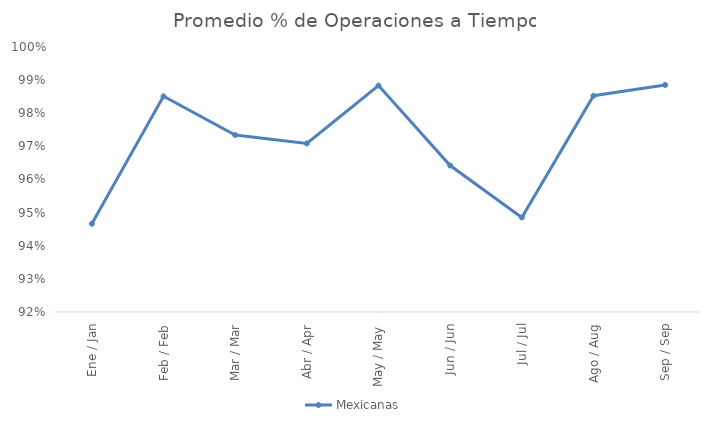
| Category | Mexicanas |
|---|---|
| Ene / Jan | 0.947 |
| Feb / Feb | 0.985 |
| Mar / Mar | 0.973 |
| Abr / Apr | 0.971 |
| May / May | 0.988 |
| Jun / Jun | 0.964 |
| Jul / Jul | 0.949 |
| Ago / Aug | 0.985 |
| Sep / Sep | 0.989 |